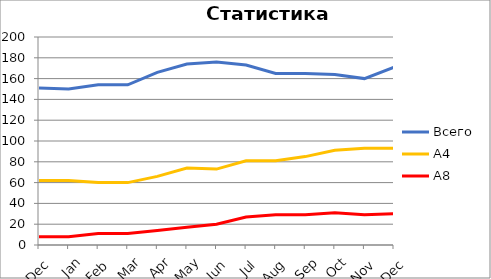
| Category | Всего | А4 | A8 |
|---|---|---|---|
| 0 | 151 | 62 | 8 |
| 1 | 150 | 62 | 8 |
| 2 | 154 | 60 | 11 |
| 3 | 154 | 60 | 11 |
| 4 | 166 | 66 | 14 |
| 5 | 174 | 74 | 17 |
| 6 | 176 | 73 | 20 |
| 7 | 173 | 81 | 27 |
| 8 | 165 | 81 | 29 |
| 9 | 165 | 85 | 29 |
| 10 | 164 | 91 | 31 |
| 11 | 160 | 93 | 29 |
| 12 | 171 | 93 | 30 |